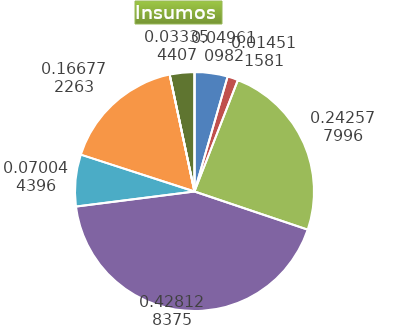
| Category | Series 0 |
|---|---|
| Control arvenses | 1561368 |
| Control fitosanitario | 507900 |
| Cosecha y beneficio | 8490140.845 |
| Fertilización | 14984336 |
| Instalación | 2451528.169 |
| Otros | 5836968 |
| Podas | 0 |
| Riego | 0 |
| Transporte | 1167392 |
| Tutorado | 0 |